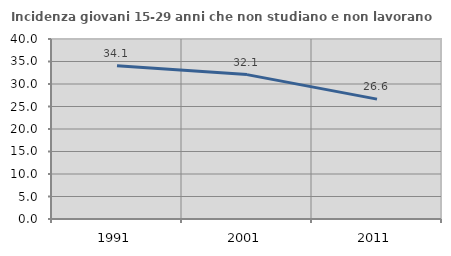
| Category | Incidenza giovani 15-29 anni che non studiano e non lavorano  |
|---|---|
| 1991.0 | 34.081 |
| 2001.0 | 32.088 |
| 2011.0 | 26.633 |